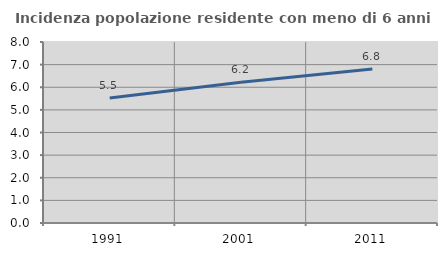
| Category | Incidenza popolazione residente con meno di 6 anni |
|---|---|
| 1991.0 | 5.526 |
| 2001.0 | 6.222 |
| 2011.0 | 6.809 |